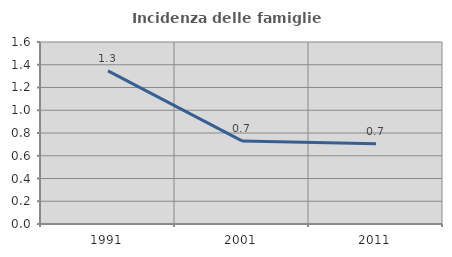
| Category | Incidenza delle famiglie numerose |
|---|---|
| 1991.0 | 1.346 |
| 2001.0 | 0.73 |
| 2011.0 | 0.706 |